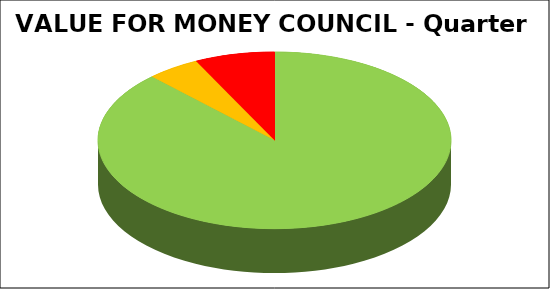
| Category | Series 0 |
|---|---|
| Green | 0.878 |
| Amber | 0.049 |
| Red | 0.073 |